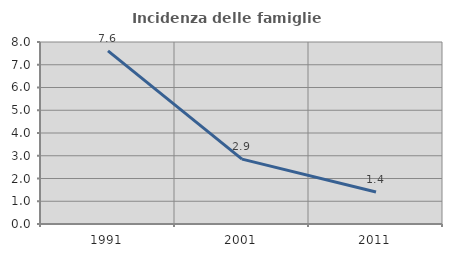
| Category | Incidenza delle famiglie numerose |
|---|---|
| 1991.0 | 7.61 |
| 2001.0 | 2.852 |
| 2011.0 | 1.408 |